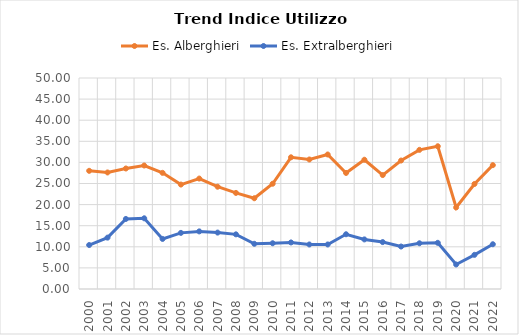
| Category | Es. Alberghieri | Es. Extralberghieri |
|---|---|---|
| 2000.0 | 28.004 | 10.42 |
| 2001.0 | 27.616 | 12.171 |
| 2002.0 | 28.555 | 16.599 |
| 2003.0 | 29.264 | 16.755 |
| 2004.0 | 27.523 | 11.867 |
| 2005.0 | 24.75 | 13.299 |
| 2006.0 | 26.17 | 13.652 |
| 2007.0 | 24.239 | 13.369 |
| 2008.0 | 22.77 | 12.951 |
| 2009.0 | 21.505 | 10.71 |
| 2010.0 | 24.945 | 10.84 |
| 2011.0 | 31.206 | 11.032 |
| 2012.0 | 30.691 | 10.55 |
| 2013.0 | 31.873 | 10.552 |
| 2014.0 | 27.501 | 12.972 |
| 2015.0 | 30.632 | 11.751 |
| 2016.0 | 26.998 | 11.115 |
| 2017.0 | 30.441 | 10.064 |
| 2018.0 | 32.971 | 10.835 |
| 2019.0 | 33.826 | 10.943 |
| 2020.0 | 19.323 | 5.811 |
| 2021.0 | 24.888 | 8.095 |
| 2022.0 | 29.348 | 10.606 |